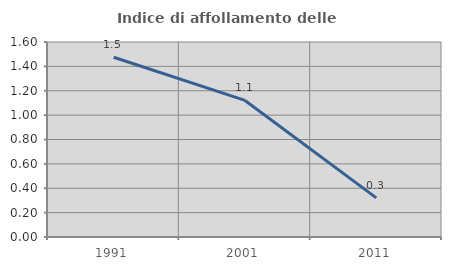
| Category | Indice di affollamento delle abitazioni  |
|---|---|
| 1991.0 | 1.475 |
| 2001.0 | 1.12 |
| 2011.0 | 0.321 |